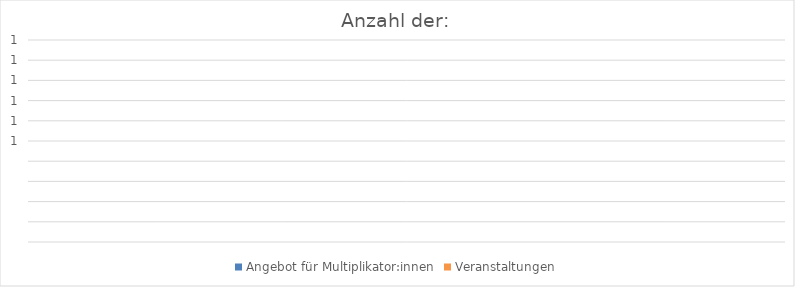
| Category | Angebot für Multiplikator:innen | Veranstaltungen |
|---|---|---|
| 0 | 0 | 0 |